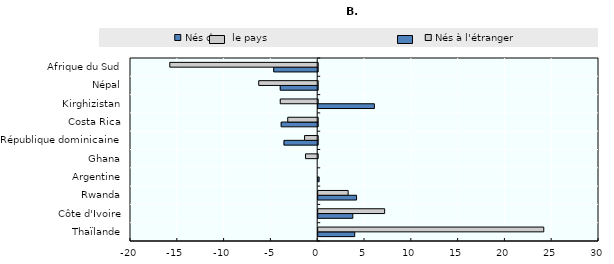
| Category | Nés dans le pays | Nés à l'étranger |
|---|---|---|
| Thaïlande | 3.9 | 24.1 |
| Côte d'Ivoire | 3.7 | 7.1 |
| Rwanda | 4.1 | 3.2 |
| Argentine | 0.1 | 0 |
| Ghana | 0 | -1.3 |
| République dominicaine | -3.6 | -1.4 |
| Costa Rica | -3.9 | -3.2 |
| Kirghizistan | 6 | -4 |
| Népal | -4 | -6.3 |
| Afrique du Sud | -4.7 | -15.8 |